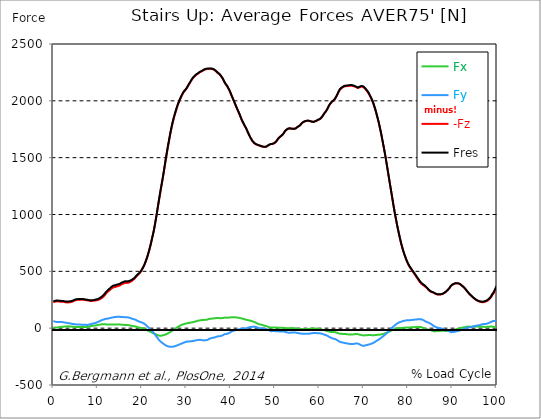
| Category |  Fx |  Fy |  -Fz |  Fres |
|---|---|---|---|---|
| 0.0 | 6.272 | 63.221 | 226.674 | 236.235 |
| 0.16678370786516855 | 5.522 | 60.516 | 229.602 | 238.31 |
| 0.3335674157303371 | 4.919 | 58.023 | 232.298 | 240.265 |
| 0.5003511235955057 | 4.818 | 56.18 | 234.225 | 241.682 |
| 0.6671348314606742 | 5.095 | 54.809 | 235.531 | 242.637 |
| 0.8339185393258427 | 5.679 | 54.077 | 236.42 | 243.378 |
| 1.0007022471910114 | 6.596 | 54.095 | 236.244 | 243.276 |
| 1.1674859550561796 | 7.717 | 54.234 | 235.142 | 242.294 |
| 1.3342696629213484 | 8.949 | 54.605 | 233.9 | 241.228 |
| 1.5010533707865168 | 10.08 | 54.753 | 232.965 | 240.385 |
| 1.6678370786516854 | 10.895 | 54.651 | 232.65 | 240.145 |
| 1.8346207865168538 | 11.608 | 54.614 | 232.307 | 239.904 |
| 2.001404494382023 | 12.183 | 54.234 | 231.983 | 239.598 |
| 2.1681882022471908 | 12.646 | 52.335 | 231.927 | 239.172 |
| 2.334971910112359 | 13.202 | 50.501 | 231.436 | 238.449 |
| 2.501755617977528 | 14.304 | 50.491 | 229.296 | 236.8 |
| 2.668539325842697 | 15.008 | 49.231 | 227.98 | 235.596 |
| 2.8353230337078656 | 15.49 | 47.277 | 227.156 | 234.641 |
| 3.0021067415730336 | 15.75 | 46.434 | 226.859 | 234.475 |
| 3.168890449438202 | 15.898 | 45.729 | 226.767 | 234.567 |
| 3.335674157303371 | 15.926 | 44.794 | 226.693 | 234.697 |
| 3.502457865168539 | 15.805 | 44.043 | 227.063 | 235.207 |
| 3.6692415730337076 | 15.342 | 42.505 | 227.628 | 235.901 |
| 3.8360252808988764 | 14.925 | 41.134 | 228.61 | 236.902 |
| 4.002808988764046 | 14.536 | 39.856 | 229.833 | 238.06 |
| 4.169592696629214 | 13.934 | 38.336 | 231.538 | 239.496 |
| 4.3363764044943816 | 13.396 | 37.215 | 233.974 | 241.692 |
| 4.50316011235955 | 12.85 | 36.419 | 236.568 | 244.267 |
| 4.669943820224718 | 12.109 | 35.854 | 239.626 | 247.223 |
| 4.836727528089888 | 11.219 | 35.631 | 243.211 | 250.502 |
| 5.003511235955056 | 10.506 | 34.001 | 246.454 | 253.143 |
| 5.170294943820225 | 10.163 | 32.444 | 248.186 | 254.467 |
| 5.337078651685394 | 10.135 | 31.629 | 249.029 | 255.227 |
| 5.5038623595505625 | 10.348 | 31.055 | 249.4 | 255.579 |
| 5.670646067415731 | 10.83 | 31.453 | 249.252 | 255.755 |
| 5.837429775280899 | 11.229 | 32.528 | 248.464 | 255.505 |
| 6.004213483146067 | 10.895 | 32.092 | 248.723 | 255.811 |
| 6.170997191011236 | 9.959 | 31.045 | 250.234 | 256.913 |
| 6.329002808988764 | 9.654 | 30.267 | 250.984 | 257.358 |
| 6.495786516853932 | 9.617 | 29.619 | 251.141 | 257.284 |
| 6.662570224719101 | 9.496 | 28.951 | 251.114 | 257.061 |
| 6.82935393258427 | 9.709 | 29.192 | 249.946 | 255.922 |
| 6.9961376404494375 | 9.793 | 29.804 | 248.084 | 254.152 |
| 7.162921348314607 | 10.172 | 30.1 | 246.871 | 252.744 |
| 7.329705056179775 | 10.061 | 29.081 | 246.583 | 251.948 |
| 7.496488764044945 | 9.904 | 27.877 | 246.38 | 251.243 |
| 7.663272471910113 | 10.83 | 28.284 | 245.231 | 249.974 |
| 7.830056179775281 | 11.998 | 29.09 | 243.86 | 248.575 |
| 7.996839887640449 | 13.498 | 30.425 | 242.146 | 246.945 |
| 8.16362359550562 | 15.481 | 32.963 | 240.626 | 245.518 |
| 8.330407303370787 | 17.093 | 34.825 | 239.876 | 244.981 |
| 8.497191011235955 | 18.427 | 36.502 | 239.83 | 245.184 |
| 8.663974719101123 | 19.65 | 38.207 | 239.978 | 245.518 |
| 8.830758426966291 | 20.762 | 39.791 | 240.2 | 245.963 |
| 8.99754213483146 | 21.707 | 41.208 | 240.589 | 246.657 |
| 9.16432584269663 | 22.855 | 43.098 | 241.256 | 247.667 |
| 9.331109550561798 | 23.541 | 44.395 | 242.359 | 249.085 |
| 9.497893258426966 | 24.291 | 46.054 | 243.86 | 250.928 |
| 9.664676966292134 | 25.051 | 47.795 | 245.648 | 253.05 |
| 9.831460674157304 | 26.339 | 50.584 | 246.5 | 254.486 |
| 9.998244382022472 | 27.858 | 53.678 | 246.982 | 255.496 |
| 10.16502808988764 | 28.72 | 55.967 | 249.409 | 258.368 |
| 10.331811797752808 | 29.906 | 58.894 | 252.096 | 261.647 |
| 10.498595505617978 | 31.166 | 62.109 | 255.329 | 265.576 |
| 10.665379213483147 | 32.389 | 65.454 | 259.044 | 270.06 |
| 10.832162921348315 | 33.482 | 69.02 | 263.167 | 275.053 |
| 10.998946629213483 | 34.427 | 72.346 | 267.512 | 280.158 |
| 11.165730337078653 | 34.677 | 75.061 | 272.116 | 285.207 |
| 11.33251404494382 | 34.103 | 75.922 | 278.546 | 291.498 |
| 11.49929775280899 | 34.047 | 77.961 | 285.744 | 299.002 |
| 11.666081460674157 | 34.149 | 80.666 | 293.675 | 307.395 |
| 11.832865168539326 | 33.639 | 82.491 | 302.467 | 316.289 |
| 11.999648876404493 | 32.963 | 83.668 | 310.314 | 324.09 |
| 12.166432584269662 | 31.953 | 83.112 | 315.974 | 329.389 |
| 12.333216292134832 | 31.749 | 84.121 | 322.395 | 335.837 |
| 12.5 | 31.675 | 85.687 | 328.148 | 341.711 |
| 12.66678370786517 | 32.453 | 88.059 | 333.493 | 347.538 |
| 12.833567415730336 | 32.861 | 89.754 | 339.163 | 353.505 |
| 13.000351123595506 | 33.148 | 91.376 | 345.111 | 359.703 |
| 13.167134831460674 | 33.278 | 92.951 | 350.234 | 364.974 |
| 13.333918539325843 | 32.972 | 93.923 | 354.616 | 369.43 |
| 13.500702247191011 | 32.694 | 94.915 | 358.915 | 373.812 |
| 13.667485955056181 | 32.963 | 96.119 | 360.796 | 375.98 |
| 13.834269662921349 | 33.074 | 97.444 | 361.583 | 377.157 |
| 14.001053370786519 | 33.13 | 99.176 | 362.352 | 378.472 |
| 14.167837078651687 | 32.87 | 99.074 | 364.909 | 380.789 |
| 14.334620786516853 | 32.944 | 99.315 | 367.615 | 383.355 |
| 14.501404494382026 | 33.269 | 99.908 | 369.023 | 384.819 |
| 14.668188202247192 | 33.491 | 100.362 | 370.134 | 385.977 |
| 14.834971910112362 | 33.232 | 100.325 | 372.2 | 387.885 |
| 15.001755617977528 | 32.361 | 99.575 | 375.749 | 391.017 |
| 15.168539325842698 | 31.434 | 98.871 | 380.057 | 394.935 |
| 15.335323033707864 | 30.573 | 98.342 | 384.42 | 398.938 |
| 15.502106741573034 | 30.397 | 98.398 | 387.552 | 401.967 |
| 15.6688904494382 | 30.054 | 98.046 | 390.192 | 404.598 |
| 15.83567415730337 | 28.961 | 96.851 | 393.351 | 407.507 |
| 16.00245786516854 | 28.72 | 96.953 | 395.547 | 409.685 |
| 16.16924157303371 | 28.266 | 96.554 | 398.271 | 412.167 |
| 16.336025280898877 | 27.895 | 95.85 | 399.04 | 412.658 |
| 16.502808988764045 | 28.257 | 96.267 | 397.706 | 411.519 |
| 16.669592696629216 | 27.738 | 95.433 | 398.215 | 411.732 |
| 16.83637640449438 | 27.117 | 94.479 | 398.928 | 412.084 |
| 17.003160112359552 | 26.209 | 93.173 | 400.679 | 413.372 |
| 17.169943820224717 | 24.968 | 91.44 | 403.644 | 415.725 |
| 17.336727528089888 | 23.661 | 89.513 | 406.942 | 418.375 |
| 17.503511235955056 | 22.077 | 87.021 | 410.935 | 421.562 |
| 17.670294943820224 | 20.493 | 84.464 | 415.28 | 425.11 |
| 17.837078651685395 | 18.964 | 81.907 | 420.19 | 429.279 |
| 18.003862359550563 | 17.973 | 80.027 | 424.758 | 433.318 |
| 18.17064606741573 | 17.102 | 78.461 | 430.224 | 438.386 |
| 18.3374297752809 | 16.231 | 76.793 | 436.885 | 444.667 |
| 18.504213483146067 | 14.749 | 74.366 | 444.528 | 451.801 |
| 18.662219101123597 | 13.341 | 71.522 | 452.31 | 458.944 |
| 18.829002808988765 | 11.108 | 67.844 | 459.981 | 465.762 |
| 18.995786516853933 | 8.792 | 64.036 | 467.411 | 472.387 |
| 19.1625702247191 | 6.837 | 60.812 | 473.369 | 477.797 |
| 19.32935393258427 | 5.142 | 58.274 | 478.39 | 482.401 |
| 19.49613764044944 | 3.993 | 56.059 | 485.579 | 489.303 |
| 19.662921348314608 | 2.779 | 53.753 | 494.658 | 498.077 |
| 19.829705056179776 | 1.649 | 51.492 | 505.025 | 508.157 |
| 19.996488764044944 | 0.435 | 49.157 | 516.059 | 518.941 |
| 20.163272471910112 | -0.917 | 46.702 | 527.39 | 530.039 |
| 20.33005617977528 | -2.613 | 43.663 | 539.1 | 541.435 |
| 20.49683988764045 | -5.003 | 39.494 | 553.849 | 555.813 |
| 20.663623595505616 | -7.736 | 34.77 | 570.145 | 571.785 |
| 20.830407303370787 | -10.71 | 29.628 | 587.386 | 588.748 |
| 20.997191011235955 | -14.138 | 23.763 | 605.591 | 606.703 |
| 21.163974719101123 | -17.825 | 17.269 | 624.713 | 625.649 |
| 21.330758426966295 | -21.438 | 10.645 | 645.892 | 646.79 |
| 21.497542134831463 | -24.968 | 4.141 | 668.386 | 669.331 |
| 21.66432584269663 | -28.498 | -2.335 | 691.742 | 692.835 |
| 21.8311095505618 | -31.768 | -8.616 | 716.533 | 717.83 |
| 21.997893258426966 | -34.705 | -14.897 | 743.317 | 744.809 |
| 22.164676966292134 | -37.512 | -21.077 | 771.296 | 773.056 |
| 22.331460674157306 | -40.254 | -27.488 | 800.368 | 802.397 |
| 22.498244382022467 | -43.21 | -34.807 | 828.411 | 830.69 |
| 22.66502808988764 | -46.304 | -42.681 | 857.983 | 860.624 |
| 22.831811797752806 | -49.574 | -51.288 | 892.558 | 895.727 |
| 22.99859550561798 | -52.993 | -60.256 | 928.949 | 932.72 |
| 23.165379213483146 | -56.208 | -69.243 | 967.082 | 971.492 |
| 23.332162921348313 | -58.848 | -78.007 | 1005.891 | 1010.894 |
| 23.49894662921348 | -61.423 | -86.929 | 1045.543 | 1051.157 |
| 23.665730337078653 | -63.758 | -95.674 | 1085.334 | 1091.569 |
| 23.83251404494382 | -65.787 | -104.031 | 1125.467 | 1132.305 |
| 23.999297752808985 | -66.473 | -111.053 | 1164.23 | 1171.512 |
| 24.166081460674157 | -66.936 | -117.492 | 1203.02 | 1210.701 |
| 24.332865168539325 | -66.074 | -122.791 | 1239.291 | 1247.221 |
| 24.499648876404496 | -64.722 | -127.887 | 1276.988 | 1285.113 |
| 24.666432584269664 | -63.443 | -132.64 | 1313.675 | 1321.976 |
| 24.833216292134832 | -61.803 | -137.124 | 1352.16 | 1360.6 |
| 25.0 | -59.737 | -141.839 | 1392.84 | 1401.438 |
| 25.16678370786517 | -57.81 | -146.481 | 1434.252 | 1442.989 |
| 25.33356741573034 | -55.633 | -150.798 | 1475.294 | 1484.151 |
| 25.500351123595504 | -53.308 | -154.67 | 1515.289 | 1524.22 |
| 25.66713483146067 | -50.269 | -157.932 | 1554.172 | 1563.14 |
| 25.833918539325843 | -46.137 | -159.72 | 1590.933 | 1599.772 |
| 26.00070224719101 | -41.653 | -160.989 | 1627.019 | 1635.681 |
| 26.16748595505618 | -37.66 | -162.323 | 1662.789 | 1671.312 |
| 26.334269662921347 | -34.093 | -163.87 | 1698.744 | 1707.166 |
| 26.50105337078652 | -30.063 | -164.574 | 1732.513 | 1740.777 |
| 26.667837078651687 | -25.644 | -164.315 | 1763.197 | 1771.229 |
| 26.834620786516858 | -21.03 | -163.852 | 1793.056 | 1800.839 |
| 27.001404494382022 | -16.565 | -163.036 | 1820.98 | 1828.521 |
| 27.16818820224719 | -12.303 | -161.591 | 1845.91 | 1853.229 |
| 27.334971910112362 | -7.866 | -159.581 | 1869.368 | 1876.409 |
| 27.50175561797753 | -3.428 | -157.478 | 1891.464 | 1898.264 |
| 27.668539325842698 | 0.778 | -155.375 | 1913.43 | 1920.008 |
| 27.835323033707866 | 4.836 | -152.892 | 1934.877 | 1941.205 |
| 28.002106741573037 | 8.94 | -150.242 | 1954.518 | 1960.595 |
| 28.168890449438205 | 12.952 | -147.481 | 1972.648 | 1978.494 |
| 28.335674157303373 | 16.991 | -144.646 | 1989.63 | 1995.244 |
| 28.502457865168537 | 20.678 | -141.885 | 2005.417 | 2010.8 |
| 28.669241573033705 | 23.819 | -139.254 | 2019.888 | 2025.085 |
| 28.836025280898877 | 27.191 | -136.392 | 2034.776 | 2039.751 |
| 29.002808988764052 | 30.063 | -133.779 | 2048.571 | 2053.37 |
| 29.169592696629213 | 32.259 | -131.426 | 2060.726 | 2065.386 |
| 29.336376404494384 | 34.603 | -128.869 | 2071.954 | 2076.466 |
| 29.50316011235955 | 36.873 | -126.321 | 2081.571 | 2085.953 |
| 29.669943820224724 | 38.494 | -123.755 | 2088.445 | 2092.725 |
| 29.836727528089884 | 39.902 | -121.67 | 2096.348 | 2100.517 |
| 30.003511235955056 | 41.144 | -120.123 | 2105.612 | 2109.67 |
| 30.170294943820224 | 44.127 | -117.538 | 2115.896 | 2119.796 |
| 30.337078651685395 | 44.979 | -117.798 | 2127.254 | 2131.145 |
| 30.503862359550563 | 45.618 | -118.057 | 2138.742 | 2142.615 |
| 30.670646067415728 | 46.656 | -117.492 | 2149.72 | 2153.547 |
| 30.837429775280903 | 48.481 | -115.954 | 2159.782 | 2163.534 |
| 30.99543539325843 | 49.546 | -115.269 | 2171.483 | 2175.188 |
| 31.162219101123597 | 50.491 | -115 | 2182.211 | 2185.898 |
| 31.32900280898876 | 51.594 | -114.009 | 2192.059 | 2195.7 |
| 31.495786516853936 | 52.993 | -112.851 | 2201.018 | 2204.622 |
| 31.6625702247191 | 54.892 | -111.442 | 2208.318 | 2211.885 |
| 31.82935393258427 | 56.884 | -110.006 | 2215.267 | 2218.796 |
| 31.996137640449433 | 58.848 | -108.617 | 2222.057 | 2225.55 |
| 32.162921348314605 | 60.33 | -107.348 | 2227.542 | 2231.007 |
| 32.329705056179776 | 61.618 | -106.217 | 2232.313 | 2235.75 |
| 32.49648876404494 | 63.665 | -104.689 | 2235.936 | 2239.363 |
| 32.66327247191011 | 66.343 | -102.65 | 2239.354 | 2242.764 |
| 32.83005617977528 | 66.88 | -103.058 | 2245.515 | 2248.943 |
| 32.996839887640455 | 67.844 | -103.169 | 2250.462 | 2253.909 |
| 33.16362359550562 | 69.271 | -102.808 | 2254.177 | 2257.642 |
| 33.330407303370784 | 70.521 | -103.058 | 2257.476 | 2260.996 |
| 33.497191011235955 | 71.327 | -104.8 | 2260.06 | 2263.683 |
| 33.66397471910113 | 71.411 | -106.782 | 2264.137 | 2267.861 |
| 33.83075842696629 | 71.614 | -107.829 | 2268.519 | 2272.299 |
| 33.997542134831455 | 72.309 | -107.348 | 2271.965 | 2275.754 |
| 34.164325842696634 | 73.023 | -106.773 | 2274.707 | 2278.487 |
| 34.3311095505618 | 73.995 | -105.949 | 2277.144 | 2280.915 |
| 34.49789325842697 | 74.273 | -105.634 | 2278.876 | 2282.656 |
| 34.66467696629213 | 74.162 | -105.541 | 2280.451 | 2284.25 |
| 34.831460674157306 | 76.247 | -102.372 | 2280.72 | 2284.491 |
| 34.99824438202247 | 79.61 | -96.666 | 2280.312 | 2284.055 |
| 35.16502808988764 | 81.324 | -93.618 | 2281.295 | 2285.037 |
| 35.331811797752806 | 82.584 | -91.042 | 2282.026 | 2285.76 |
| 35.49859550561798 | 83.102 | -89.541 | 2281.702 | 2285.417 |
| 35.66537921348315 | 83.705 | -87.596 | 2281.072 | 2284.75 |
| 35.83216292134831 | 84.807 | -85.511 | 2279.581 | 2283.222 |
| 35.998946629213485 | 85.428 | -84.288 | 2277.533 | 2281.156 |
| 36.16573033707865 | 86.048 | -83.278 | 2275.004 | 2278.617 |
| 36.33251404494382 | 86.641 | -82.018 | 2270.789 | 2274.43 |
| 36.499297752808985 | 87.383 | -80.314 | 2265.897 | 2269.519 |
| 36.666081460674164 | 88.411 | -78.118 | 2260.69 | 2264.294 |
| 36.83286516853932 | 89.671 | -75.135 | 2254.298 | 2257.892 |
| 36.99964887640449 | 90.607 | -72.726 | 2247.461 | 2251.018 |
| 37.166432584269664 | 90.208 | -71.744 | 2241.893 | 2245.395 |
| 37.333216292134836 | 88.782 | -71.485 | 2237.362 | 2240.818 |
| 37.5 | 87.392 | -71.188 | 2232.749 | 2236.139 |
| 37.666783707865164 | 87.373 | -69.836 | 2225.309 | 2228.672 |
| 37.833567415730336 | 87.864 | -67.862 | 2216.406 | 2219.732 |
| 38.00035112359551 | 88.624 | -65.583 | 2206.502 | 2209.801 |
| 38.16713483146068 | 89.198 | -63.647 | 2196.284 | 2199.582 |
| 38.333918539325836 | 90.032 | -60.219 | 2185.037 | 2188.316 |
| 38.50070224719101 | 91.82 | -55.948 | 2171.575 | 2174.846 |
| 38.66748595505618 | 93.145 | -52.622 | 2158.327 | 2161.607 |
| 38.83426966292135 | 93.108 | -51.233 | 2148.025 | 2151.268 |
| 39.001053370786515 | 92.571 | -50.621 | 2139.39 | 2142.596 |
| 39.16783707865169 | 92.321 | -49.889 | 2130.654 | 2133.841 |
| 39.33462078651686 | 92.385 | -47.443 | 2119.24 | 2122.381 |
| 39.50140449438202 | 93.034 | -44.896 | 2106.9 | 2110.05 |
| 39.668188202247194 | 93.534 | -42.404 | 2094.986 | 2098.108 |
| 39.83497191011236 | 94.081 | -38.753 | 2080.635 | 2083.748 |
| 40.00175561797753 | 94.915 | -34.871 | 2065.201 | 2068.332 |
| 40.168539325842694 | 95.545 | -30.11 | 2047.83 | 2050.998 |
| 40.335323033707866 | 95.498 | -27.404 | 2032.673 | 2035.851 |
| 40.50210674157304 | 95.637 | -24.736 | 2017.896 | 2021.037 |
| 40.6688904494382 | 95.665 | -22.439 | 2002.702 | 2005.806 |
| 40.83567415730337 | 95.609 | -20.076 | 1986.99 | 1990.084 |
| 41.00245786516854 | 95.174 | -18.14 | 1971.314 | 1974.381 |
| 41.16924157303371 | 94.488 | -16.639 | 1955 | 1958.038 |
| 41.33602528089887 | 93.933 | -15.305 | 1939.315 | 1942.326 |
| 41.502808988764045 | 93.46 | -13.498 | 1924.112 | 1927.104 |
| 41.669592696629216 | 92.385 | -12.229 | 1909.715 | 1912.661 |
| 41.83637640449439 | 91.144 | -11.173 | 1895.207 | 1898.097 |
| 42.00316011235955 | 89.977 | -10.024 | 1880.161 | 1882.996 |
| 42.16994382022472 | 88.624 | -8.468 | 1863.846 | 1866.635 |
| 42.33672752808989 | 87.142 | -6.846 | 1847.319 | 1850.052 |
| 42.50351123595506 | 85.576 | -5.485 | 1830.605 | 1833.283 |
| 42.670294943820224 | 83.779 | -4.345 | 1817.014 | 1819.646 |
| 42.83707865168539 | 81.842 | -4.03 | 1804.869 | 1807.463 |
| 43.00386235955057 | 80.008 | -3.632 | 1791.815 | 1794.381 |
| 43.17064606741573 | 78.137 | -2.752 | 1778.928 | 1781.457 |
| 43.32865168539326 | 76.154 | -1.964 | 1767.69 | 1770.21 |
| 43.495435393258425 | 74.357 | -0.787 | 1755.647 | 1758.139 |
| 43.6622191011236 | 72.921 | 1.297 | 1740.666 | 1743.139 |
| 43.82900280898876 | 71.438 | 3.511 | 1725.676 | 1728.131 |
| 43.99578651685393 | 69.873 | 5.475 | 1711.168 | 1713.586 |
| 44.162570224719104 | 68.39 | 7.551 | 1697.873 | 1700.254 |
| 44.32935393258427 | 66.815 | 8.82 | 1684.959 | 1687.293 |
| 44.49613764044944 | 65.231 | 10.07 | 1672.053 | 1674.341 |
| 44.66292134831461 | 63.258 | 11.127 | 1661.121 | 1663.354 |
| 44.82970505617978 | 61.247 | 12.164 | 1650.337 | 1652.524 |
| 44.99648876404493 | 59.043 | 12.831 | 1641.48 | 1643.648 |
| 45.16327247191011 | 56.902 | 13.091 | 1633.726 | 1635.848 |
| 45.33005617977528 | 54.846 | 13.026 | 1626.88 | 1628.946 |
| 45.49683988764045 | 52.409 | 12.516 | 1621.58 | 1623.581 |
| 45.66362359550561 | 49.074 | 10.849 | 1618.18 | 1620.052 |
| 45.83040730337079 | 45.739 | 8.968 | 1615.382 | 1617.133 |
| 45.99719101123596 | 42.385 | 6.754 | 1613.011 | 1614.623 |
| 46.16397471910113 | 39.115 | 4.54 | 1610.518 | 1612.01 |
| 46.33075842696629 | 35.965 | 2.085 | 1607.887 | 1609.258 |
| 46.497542134831455 | 33.825 | 0.25 | 1605.692 | 1607.007 |
| 46.66432584269663 | 32.379 | -0.954 | 1604.006 | 1605.303 |
| 46.83110955056179 | 31.036 | -1.251 | 1601.467 | 1602.699 |
| 46.99789325842696 | 29.498 | -1.695 | 1599.234 | 1600.411 |
| 47.164676966292134 | 27.701 | -2.492 | 1597.53 | 1598.669 |
| 47.331460674157306 | 25.894 | -3.298 | 1595.844 | 1596.946 |
| 47.49824438202247 | 23.782 | -4.484 | 1594.973 | 1596.066 |
| 47.66502808988764 | 21.679 | -5.67 | 1594.111 | 1595.186 |
| 47.83181179775281 | 19.807 | -6.596 | 1595.325 | 1596.362 |
| 47.99859550561797 | 17.945 | -7.523 | 1596.548 | 1597.53 |
| 48.16537921348314 | 15.768 | -9.718 | 1599.67 | 1600.633 |
| 48.33216292134831 | 13.396 | -12.757 | 1604.052 | 1604.997 |
| 48.498946629213485 | 11.015 | -15.796 | 1608.443 | 1609.37 |
| 48.66573033707865 | 8.644 | -18.835 | 1612.816 | 1613.733 |
| 48.83251404494382 | 6.67 | -22.355 | 1615.623 | 1616.55 |
| 48.99929775280899 | 4.697 | -25.866 | 1618.421 | 1619.357 |
| 49.166081460674164 | 4.456 | -26.876 | 1620.265 | 1621.219 |
| 49.33286516853933 | 5.346 | -25.663 | 1620.719 | 1621.645 |
| 49.499648876404486 | 6.216 | -24.282 | 1621.599 | 1622.516 |
| 49.666432584269664 | 6.281 | -24.264 | 1623.896 | 1624.814 |
| 49.83321629213483 | 5.8 | -25.273 | 1627 | 1627.908 |
| 50.0 | 5.763 | -26.015 | 1631.994 | 1632.911 |
| 50.166783707865164 | 5.966 | -26.617 | 1637.997 | 1638.923 |
| 50.33356741573034 | 6.031 | -26.867 | 1644.964 | 1645.89 |
| 50.50035112359551 | 5.716 | -27.043 | 1653.181 | 1654.099 |
| 50.66713483146068 | 4.15 | -27.775 | 1664.197 | 1665.123 |
| 50.83391853932584 | 3.659 | -28.266 | 1672.257 | 1673.202 |
| 51.00070224719101 | 3.9 | -28.46 | 1678.612 | 1679.548 |
| 51.16748595505618 | 3.65 | -28.544 | 1683.902 | 1684.81 |
| 51.33426966292134 | 3.558 | -28.544 | 1689.072 | 1689.952 |
| 51.50105337078652 | 3.928 | -28.349 | 1694.177 | 1695.038 |
| 51.66783707865169 | 4.28 | -28.266 | 1700.402 | 1701.273 |
| 51.83462078651686 | 4.104 | -28.581 | 1708.342 | 1709.231 |
| 52.00140449438202 | 2.622 | -29.989 | 1716.68 | 1717.56 |
| 52.168188202247194 | 1.427 | -31.36 | 1727.825 | 1728.733 |
| 52.33497191011236 | 0.491 | -32.592 | 1736.756 | 1737.655 |
| 52.50175561797752 | -0.315 | -34.547 | 1742.667 | 1743.566 |
| 52.668539325842694 | -1.047 | -36.53 | 1747.586 | 1748.513 |
| 52.835323033707866 | -1.797 | -38.596 | 1752.126 | 1753.08 |
| 53.00210674157304 | -1.908 | -40.097 | 1755.359 | 1756.286 |
| 53.1688904494382 | -1.297 | -40.662 | 1757.629 | 1758.528 |
| 53.33567415730337 | -0.213 | -40.263 | 1757.194 | 1758.092 |
| 53.502457865168545 | 0.584 | -39.291 | 1756.23 | 1757.101 |
| 53.669241573033716 | 0.343 | -38.753 | 1755.091 | 1755.943 |
| 53.83602528089887 | 0.102 | -38.225 | 1753.96 | 1754.785 |
| 54.002808988764045 | -0.167 | -37.845 | 1753.377 | 1754.183 |
| 54.169592696629216 | -0.472 | -37.632 | 1753.395 | 1754.201 |
| 54.33637640449438 | -0.778 | -37.428 | 1753.423 | 1754.238 |
| 54.50316011235955 | -0.889 | -37.836 | 1754.942 | 1755.739 |
| 54.669943820224724 | -1.112 | -38.336 | 1756.749 | 1757.527 |
| 54.836727528089895 | -2.538 | -39.837 | 1761.567 | 1762.363 |
| 55.00351123595506 | -4.076 | -41.394 | 1767.681 | 1768.533 |
| 55.17029494382022 | -6.05 | -43.497 | 1772.647 | 1773.527 |
| 55.337078651685395 | -6.559 | -44.534 | 1775.926 | 1776.816 |
| 55.50386235955056 | -6.392 | -44.905 | 1778.511 | 1779.41 |
| 55.66186797752809 | -6.726 | -45.98 | 1784.598 | 1785.515 |
| 55.82865168539326 | -7.606 | -47.499 | 1792.334 | 1793.279 |
| 55.995435393258425 | -8.106 | -48.564 | 1800.783 | 1801.756 |
| 56.1622191011236 | -8.236 | -48.935 | 1806.573 | 1807.574 |
| 56.32900280898877 | -8.431 | -49.333 | 1811.826 | 1812.855 |
| 56.49578651685393 | -8.579 | -49.222 | 1815.356 | 1816.375 |
| 56.6625702247191 | -8.727 | -49.111 | 1818.877 | 1819.896 |
| 56.82935393258427 | -8.31 | -48.601 | 1820.739 | 1821.721 |
| 56.99613764044943 | -7.736 | -48.277 | 1822.138 | 1823.073 |
| 57.16292134831461 | -6.754 | -47.842 | 1825.167 | 1826.066 |
| 57.329705056179776 | -6.365 | -48.537 | 1825.38 | 1826.288 |
| 57.49648876404495 | -6.745 | -48.981 | 1824.722 | 1825.64 |
| 57.66327247191011 | -6.244 | -48.657 | 1824.055 | 1824.945 |
| 57.83005617977529 | -5.41 | -47.703 | 1821.758 | 1822.601 |
| 57.99683988764044 | -4.734 | -46.628 | 1819.868 | 1820.674 |
| 58.16362359550561 | -4.123 | -45.201 | 1818.867 | 1819.673 |
| 58.33040730337079 | -3.845 | -44.405 | 1816.681 | 1817.459 |
| 58.497191011235955 | -3.131 | -43.358 | 1815.199 | 1815.949 |
| 58.66397471910112 | -2.159 | -42.265 | 1813.985 | 1814.698 |
| 58.83075842696629 | -2.362 | -42.552 | 1815.68 | 1816.403 |
| 58.99754213483147 | -2.64 | -42.793 | 1819.062 | 1819.794 |
| 59.164325842696634 | -3.168 | -43.247 | 1821.48 | 1822.221 |
| 59.33110955056179 | -3.974 | -43.599 | 1823.981 | 1824.722 |
| 59.49789325842697 | -4.855 | -43.978 | 1828.651 | 1829.392 |
| 59.664676966292134 | -5.716 | -44.432 | 1832.347 | 1833.088 |
| 59.8314606741573 | -6.606 | -44.766 | 1834.385 | 1835.145 |
| 59.99824438202247 | -7.467 | -45.387 | 1837.007 | 1837.785 |
| 60.16502808988765 | -7.662 | -45.665 | 1841.019 | 1841.797 |
| 60.33181179775281 | -8.773 | -46.526 | 1846.022 | 1846.837 |
| 60.49859550561798 | -10.71 | -47.666 | 1853.285 | 1854.137 |
| 60.66537921348315 | -13.304 | -50.149 | 1862.438 | 1863.383 |
| 60.83216292134831 | -15.685 | -52.354 | 1871.619 | 1872.657 |
| 60.99894662921348 | -17.473 | -55.29 | 1881.634 | 1882.783 |
| 61.16573033707864 | -18.909 | -57.523 | 1891.39 | 1892.631 |
| 61.33251404494383 | -19.631 | -58.866 | 1899.005 | 1900.311 |
| 61.49929775280899 | -21.16 | -61.285 | 1907.528 | 1908.927 |
| 61.66608146067416 | -23.031 | -64.258 | 1918.275 | 1919.804 |
| 61.83286516853932 | -25.125 | -67.677 | 1930.032 | 1931.709 |
| 61.99964887640451 | -27.46 | -71.364 | 1942.974 | 1944.762 |
| 62.16643258426967 | -29.785 | -75.042 | 1955.852 | 1957.77 |
| 62.33321629213482 | -31.314 | -78.22 | 1966.728 | 1968.767 |
| 62.5 | -32.833 | -81.815 | 1975.548 | 1977.753 |
| 62.66678370786517 | -34.362 | -85.641 | 1983.358 | 1985.748 |
| 62.833567415730336 | -35.353 | -88.698 | 1990.677 | 1993.206 |
| 63.0003511235955 | -34.64 | -90.579 | 1994.661 | 1997.273 |
| 63.16713483146068 | -34.677 | -92.219 | 2000.748 | 2003.425 |
| 63.33391853932585 | -34.408 | -93.201 | 2006.797 | 2009.512 |
| 63.500702247191015 | -35.168 | -94.952 | 2015.246 | 2018.054 |
| 63.66748595505618 | -36.511 | -97.314 | 2024.974 | 2027.92 |
| 63.83426966292135 | -38.438 | -100.408 | 2036.471 | 2039.575 |
| 64.00105337078651 | -40.94 | -104.809 | 2048.617 | 2051.934 |
| 64.16783707865169 | -43.33 | -109.339 | 2062.921 | 2066.498 |
| 64.33462078651687 | -45.692 | -113.833 | 2077.374 | 2081.2 |
| 64.50140449438203 | -47.629 | -117.816 | 2089.807 | 2093.893 |
| 64.6681882022472 | -48.833 | -120.818 | 2099.331 | 2103.62 |
| 64.83497191011236 | -49.426 | -122.606 | 2106.02 | 2110.439 |
| 65.00175561797754 | -49.945 | -124.116 | 2111.569 | 2116.09 |
| 65.16853932584269 | -50.306 | -125.932 | 2116.794 | 2121.427 |
| 65.33532303370787 | -50.51 | -127.377 | 2120.083 | 2124.817 |
| 65.50210674157304 | -50.714 | -128.897 | 2124.326 | 2129.144 |
| 65.66889044943821 | -51.177 | -130.305 | 2126.717 | 2131.636 |
| 65.83567415730337 | -51.742 | -131.222 | 2127.865 | 2132.85 |
| 66.00245786516854 | -52.326 | -132.084 | 2128.875 | 2133.934 |
| 66.1692415730337 | -53.308 | -133.52 | 2129.681 | 2134.86 |
| 66.33602528089888 | -54.151 | -134.946 | 2130.358 | 2135.657 |
| 66.50280898876404 | -54.725 | -136.373 | 2130.839 | 2136.241 |
| 66.66959269662921 | -55.031 | -137.392 | 2131.599 | 2137.074 |
| 66.83637640449439 | -55.068 | -138.013 | 2132.637 | 2138.149 |
| 67.00316011235955 | -55.216 | -138.587 | 2133.369 | 2138.909 |
| 67.16994382022472 | -55.439 | -139.143 | 2133.924 | 2139.492 |
| 67.33672752808988 | -55.578 | -139.495 | 2133.035 | 2138.622 |
| 67.50351123595506 | -55.559 | -139.579 | 2130.96 | 2136.565 |
| 67.67029494382022 | -54.559 | -138.708 | 2129.366 | 2134.888 |
| 67.83707865168539 | -53.873 | -138.587 | 2130.321 | 2135.814 |
| 67.99508426966291 | -52.613 | -136.262 | 2125.401 | 2130.737 |
| 68.16186797752809 | -51.649 | -134.289 | 2120.287 | 2125.503 |
| 68.32865168539327 | -51.835 | -134.168 | 2119.222 | 2124.438 |
| 68.49543539325843 | -52.048 | -133.983 | 2116.34 | 2121.547 |
| 68.6622191011236 | -52.455 | -134.029 | 2112.486 | 2117.712 |
| 68.82900280898876 | -54.762 | -137.188 | 2113.33 | 2118.786 |
| 68.99578651685394 | -56.495 | -141.07 | 2117.323 | 2123.094 |
| 69.1625702247191 | -57.866 | -144.757 | 2121.214 | 2127.282 |
| 69.32935393258425 | -58.718 | -147.602 | 2123.011 | 2129.32 |
| 69.49613764044945 | -60.293 | -150.733 | 2123.974 | 2130.617 |
| 69.66292134831461 | -61.979 | -153.531 | 2124.123 | 2131.08 |
| 69.82970505617978 | -63.258 | -155.032 | 2122.103 | 2129.237 |
| 69.99648876404494 | -63.962 | -155.217 | 2118.073 | 2125.234 |
| 70.16327247191012 | -63.369 | -153.883 | 2111.819 | 2118.879 |
| 70.33005617977528 | -62.859 | -152.391 | 2104.954 | 2111.884 |
| 70.49683988764045 | -61.924 | -150.446 | 2097.524 | 2104.287 |
| 70.66362359550561 | -61.637 | -148.936 | 2089.826 | 2096.477 |
| 70.83040730337079 | -61.349 | -147.416 | 2082.127 | 2088.658 |
| 70.99719101123596 | -60.997 | -145.591 | 2072.242 | 2078.634 |
| 71.16397471910112 | -60.784 | -143.831 | 2061.208 | 2067.47 |
| 71.3307584269663 | -60.701 | -141.987 | 2049.358 | 2055.491 |
| 71.49754213483146 | -60.747 | -140.042 | 2036.888 | 2042.901 |
| 71.66432584269663 | -61.016 | -137.633 | 2023.696 | 2029.551 |
| 71.83110955056179 | -61.701 | -135.549 | 2009.169 | 2014.894 |
| 71.99789325842697 | -62.118 | -132.945 | 1993.586 | 1999.163 |
| 72.16467696629215 | -62.016 | -129.508 | 1976.678 | 1982.033 |
| 72.3314606741573 | -61.627 | -125.719 | 1957.872 | 1962.995 |
| 72.49824438202248 | -61.423 | -122.226 | 1937.832 | 1942.77 |
| 72.66502808988764 | -60.756 | -118.252 | 1916.098 | 1920.823 |
| 72.8318117977528 | -59.83 | -113.944 | 1892.427 | 1896.911 |
| 72.99859550561797 | -58.857 | -109.636 | 1868.071 | 1872.305 |
| 73.16537921348315 | -58.348 | -105.884 | 1843.548 | 1847.587 |
| 73.33216292134833 | -58.06 | -102.141 | 1818.089 | 1821.952 |
| 73.49894662921349 | -57.514 | -97.963 | 1790.861 | 1794.539 |
| 73.66573033707864 | -56.643 | -93.164 | 1761.363 | 1764.818 |
| 73.83251404494382 | -55.772 | -88.402 | 1730.938 | 1734.171 |
| 73.99929775280899 | -54.679 | -83.491 | 1698.994 | 1702.005 |
| 74.16608146067415 | -53.336 | -78.266 | 1665.79 | 1668.56 |
| 74.33286516853933 | -51.807 | -73.078 | 1632.216 | 1634.754 |
| 74.49964887640449 | -49.871 | -68.029 | 1598.16 | 1600.457 |
| 74.66643258426967 | -47.731 | -62.785 | 1563.242 | 1565.308 |
| 74.83321629213484 | -45.396 | -57.134 | 1527.583 | 1529.408 |
| 75.0 | -42.867 | -51.047 | 1490.191 | 1491.757 |
| 75.16678370786516 | -40.467 | -45.118 | 1451.216 | 1452.568 |
| 75.33356741573033 | -38.012 | -39.041 | 1411.045 | 1412.222 |
| 75.5003511235955 | -35.603 | -33.102 | 1371.143 | 1372.162 |
| 75.66713483146067 | -32.704 | -26.311 | 1331.574 | 1332.39 |
| 75.83391853932585 | -29.359 | -19.011 | 1291.496 | 1292.21 |
| 76.00070224719101 | -26.218 | -12.266 | 1252.372 | 1252.965 |
| 76.16748595505618 | -22.939 | -5.939 | 1213.619 | 1214.11 |
| 76.33426966292136 | -19.52 | 0.324 | 1174.375 | 1174.782 |
| 76.50105337078652 | -16.37 | 6.735 | 1134.176 | 1134.593 |
| 76.66783707865167 | -13.396 | 12.813 | 1094.802 | 1095.274 |
| 76.83462078651685 | -10.515 | 18.77 | 1055.9 | 1056.438 |
| 77.00140449438202 | -8.042 | 24.245 | 1019.028 | 1019.667 |
| 77.1681882022472 | -6.022 | 29.47 | 984.379 | 985.212 |
| 77.33497191011236 | -4.058 | 34.575 | 950.183 | 951.221 |
| 77.50175561797754 | -2.094 | 39.365 | 915.71 | 916.97 |
| 77.6685393258427 | -0.602 | 43.691 | 883.377 | 884.887 |
| 77.83532303370787 | 0.25 | 47.267 | 852.916 | 854.685 |
| 78.00210674157303 | 0.908 | 50.612 | 822.964 | 825.002 |
| 78.1688904494382 | 1.529 | 53.512 | 793.271 | 795.559 |
| 78.33567415730337 | 1.834 | 55.494 | 765.209 | 767.692 |
| 78.50245786516854 | 2.122 | 57.347 | 739.139 | 741.807 |
| 78.66924157303372 | 2.455 | 59.487 | 714.162 | 717.098 |
| 78.83602528089888 | 2.918 | 61.785 | 691.121 | 694.354 |
| 79.00280898876404 | 3.382 | 63.619 | 669.646 | 673.185 |
| 79.16959269662921 | 4.299 | 65.37 | 650.07 | 653.887 |
| 79.33637640449439 | 5.114 | 66.982 | 630.902 | 634.978 |
| 79.50316011235955 | 5.586 | 67.927 | 612.892 | 617.163 |
| 79.66994382022472 | 5.837 | 68.613 | 595.521 | 599.977 |
| 79.8367275280899 | 6.17 | 69.298 | 579.678 | 584.292 |
| 80.00351123595506 | 6.133 | 69.308 | 565.643 | 570.358 |
| 80.17029494382022 | 6.365 | 69.613 | 552.839 | 557.685 |
| 80.32830056179776 | 6.596 | 69.975 | 541.444 | 546.465 |
| 80.49508426966293 | 6.763 | 70.253 | 531.188 | 536.376 |
| 80.66186797752809 | 7.143 | 70.873 | 521.636 | 527.01 |
| 80.82865168539325 | 7.68 | 71.809 | 511.659 | 517.245 |
| 80.99543539325842 | 8.208 | 72.865 | 501.81 | 507.666 |
| 81.1622191011236 | 8.496 | 73.68 | 492.917 | 499.059 |
| 81.32900280898878 | 8.727 | 74.459 | 484.189 | 490.619 |
| 81.49578651685394 | 9.255 | 75.061 | 474.369 | 481.021 |
| 81.6625702247191 | 9.663 | 75.644 | 464.252 | 471.154 |
| 81.82935393258427 | 10.098 | 76.627 | 454.265 | 461.501 |
| 81.99613764044945 | 10.348 | 77.377 | 444.612 | 452.107 |
| 82.16292134831461 | 10.478 | 77.942 | 435.116 | 442.805 |
| 82.32970505617978 | 10.376 | 78.303 | 425.694 | 433.568 |
| 82.49648876404494 | 10.2 | 78.896 | 416.327 | 424.424 |
| 82.66327247191012 | 10.45 | 79.489 | 406.108 | 414.428 |
| 82.83005617977528 | 9.181 | 78.257 | 398.178 | 406.34 |
| 82.99683988764045 | 8.292 | 78.062 | 391.248 | 399.401 |
| 83.16362359550563 | 6.763 | 76.673 | 385.893 | 393.824 |
| 83.33040730337079 | 4.679 | 74.19 | 381.141 | 388.645 |
| 83.49719101123596 | 1.946 | 70.28 | 376.962 | 383.818 |
| 83.66397471910112 | -0.973 | 65.722 | 372.784 | 378.917 |
| 83.8307584269663 | -3.613 | 62.572 | 367.429 | 373.099 |
| 83.99754213483146 | -6.254 | 59.32 | 362.01 | 367.327 |
| 84.16432584269663 | -8.977 | 55.707 | 356.775 | 361.741 |
| 84.33110955056179 | -10.747 | 52.715 | 350.04 | 354.765 |
| 84.49789325842697 | -11.821 | 50.417 | 342.184 | 346.714 |
| 84.66467696629213 | -12.794 | 47.684 | 334.837 | 339.154 |
| 84.8314606741573 | -14.11 | 44.673 | 328.87 | 332.947 |
| 84.99824438202248 | -15.796 | 41.292 | 324.34 | 328.083 |
| 85.16502808988764 | -17.88 | 37.605 | 320.505 | 323.84 |
| 85.3318117977528 | -20.4 | 33.352 | 318.059 | 321.033 |
| 85.49859550561797 | -23.226 | 28.655 | 315.984 | 318.689 |
| 85.66537921348315 | -25.857 | 23.939 | 313.667 | 316.123 |
| 85.83216292134831 | -27.126 | 19.177 | 310.749 | 313.056 |
| 85.99894662921348 | -27.404 | 14.925 | 307.247 | 309.554 |
| 86.16573033707866 | -27.015 | 11.784 | 303.458 | 305.756 |
| 86.33251404494384 | -26.524 | 8.866 | 299.863 | 302.124 |
| 86.499297752809 | -25.422 | 7.245 | 297.381 | 299.521 |
| 86.66608146067415 | -25.44 | 4.53 | 296.361 | 298.437 |
| 86.83286516853933 | -25.375 | 1.64 | 296.222 | 298.251 |
| 86.99964887640449 | -24.745 | -0.343 | 296.269 | 298.288 |
| 87.16643258426966 | -23.402 | 0.009 | 296.454 | 298.233 |
| 87.33321629213482 | -22.309 | -0.046 | 296.769 | 298.344 |
| 87.5 | -22.374 | -1.927 | 297.788 | 299.308 |
| 87.66678370786518 | -22.568 | -3.873 | 299.224 | 300.706 |
| 87.83356741573033 | -22.744 | -5.688 | 301.438 | 302.939 |
| 88.00035112359551 | -22.902 | -6.735 | 304.875 | 306.413 |
| 88.16713483146067 | -23.606 | -9.126 | 308.868 | 310.518 |
| 88.33391853932584 | -24.273 | -12.627 | 312.676 | 314.511 |
| 88.500702247191 | -24.56 | -15.092 | 317.521 | 319.523 |
| 88.66748595505618 | -24.56 | -16.593 | 323.886 | 325.971 |
| 88.83426966292136 | -24.875 | -19.659 | 330.13 | 332.372 |
| 89.00105337078652 | -24.718 | -23.393 | 335.42 | 337.829 |
| 89.16783707865169 | -24.56 | -25.903 | 341.572 | 344.073 |
| 89.33462078651687 | -24.199 | -28.738 | 350.299 | 352.912 |
| 89.50140449438203 | -23.726 | -31.861 | 360.092 | 362.825 |
| 89.6681882022472 | -23.208 | -34.844 | 369.708 | 372.543 |
| 89.83497191011236 | -21.447 | -35.075 | 376.082 | 378.723 |
| 90.00175561797754 | -19.937 | -35.038 | 381.085 | 383.531 |
| 90.16853932584269 | -18.316 | -34.204 | 384.309 | 386.551 |
| 90.33532303370787 | -16.352 | -32.815 | 387.45 | 389.46 |
| 90.50210674157303 | -13.98 | -31.314 | 391.109 | 392.907 |
| 90.6688904494382 | -12.248 | -30.35 | 394.083 | 395.723 |
| 90.83567415730336 | -10.636 | -29.155 | 395.278 | 396.798 |
| 91.00245786516854 | -8.94 | -27.432 | 394.787 | 396.195 |
| 91.1692415730337 | -7.541 | -25.903 | 394.333 | 395.658 |
| 91.33602528089888 | -6.013 | -24.56 | 393.323 | 394.565 |
| 91.50280898876404 | -4.299 | -22.948 | 391.711 | 392.851 |
| 91.66959269662922 | -2.705 | -21.355 | 388.904 | 389.988 |
| 91.83637640449439 | -0.547 | -18.964 | 384.346 | 385.365 |
| 92.00316011235955 | 2.038 | -15.796 | 379.056 | 380.057 |
| 92.16994382022472 | 4.132 | -12.553 | 373.405 | 374.368 |
| 92.3367275280899 | 5.744 | -9.978 | 368.207 | 369.152 |
| 92.50351123595506 | 6.958 | -8.116 | 363.223 | 364.15 |
| 92.66151685393258 | 8.245 | -6.059 | 357.016 | 357.979 |
| 92.82830056179776 | 9.654 | -3.798 | 350.021 | 351.04 |
| 92.99508426966291 | 10.876 | -1.455 | 341.628 | 342.776 |
| 93.16186797752809 | 12.025 | 0.908 | 332.743 | 334.04 |
| 93.32865168539325 | 13.007 | 3.029 | 324.664 | 326.082 |
| 93.49543539325842 | 13.647 | 4.855 | 317.345 | 318.874 |
| 93.66221910112358 | 14.202 | 7.013 | 308.813 | 310.471 |
| 93.82900280898876 | 14.202 | 8.755 | 300.697 | 302.337 |
| 93.99578651685393 | 12.275 | 8.301 | 295.185 | 296.593 |
| 94.1625702247191 | 11.775 | 9.014 | 289.404 | 290.71 |
| 94.32935393258427 | 12.498 | 10.876 | 282.752 | 284.03 |
| 94.49613764044945 | 12.85 | 12.535 | 276.684 | 277.934 |
| 94.66292134831461 | 13.767 | 14.675 | 270.449 | 271.755 |
| 94.82970505617978 | 14.128 | 16.491 | 265.196 | 266.613 |
| 94.99648876404494 | 14.601 | 18.279 | 259.896 | 261.462 |
| 95.16327247191012 | 14.851 | 19.696 | 254.792 | 256.515 |
| 95.33005617977528 | 15.036 | 21.067 | 249.807 | 251.697 |
| 95.49683988764046 | 14.832 | 22.17 | 245.564 | 247.667 |
| 95.66362359550563 | 14.582 | 23.272 | 241.432 | 243.739 |
| 95.83040730337078 | 13.665 | 24.384 | 238.783 | 241.228 |
| 95.99719101123594 | 12.989 | 25.607 | 236.105 | 238.736 |
| 96.16397471910112 | 12.553 | 27.024 | 233.391 | 236.3 |
| 96.33075842696628 | 12.581 | 28.998 | 231.251 | 234.725 |
| 96.49754213483145 | 12.739 | 31.101 | 229.416 | 233.502 |
| 96.66432584269663 | 12.933 | 33.195 | 228.388 | 233.002 |
| 96.8311095505618 | 13.017 | 34.992 | 227.906 | 232.881 |
| 96.99789325842697 | 12.553 | 35.863 | 228.629 | 233.734 |
| 97.16467696629213 | 11.784 | 36.28 | 230.12 | 235.318 |
| 97.3314606741573 | 11.247 | 36.437 | 232.001 | 237.254 |
| 97.49824438202248 | 10.7 | 36.595 | 233.882 | 239.2 |
| 97.66502808988764 | 10.71 | 38.04 | 236.226 | 241.821 |
| 97.8318117977528 | 11.219 | 40.078 | 239.32 | 245.305 |
| 97.99859550561798 | 11.812 | 42.404 | 243.156 | 249.557 |
| 98.16537921348316 | 12.368 | 44.331 | 247.751 | 254.514 |
| 98.33216292134833 | 12.915 | 47.304 | 254.106 | 261.49 |
| 98.49894662921349 | 13.665 | 50.584 | 260.184 | 268.309 |
| 98.66573033707866 | 14.388 | 54.021 | 266.974 | 275.878 |
| 98.8325140449438 | 13.971 | 56.847 | 277.61 | 286.708 |
| 98.99929775280897 | 13.508 | 59.598 | 289.589 | 298.863 |
| 99.16608146067416 | 13.119 | 61.915 | 298.566 | 307.933 |
| 99.33286516853933 | 12.627 | 64.101 | 307.414 | 316.817 |
| 99.49964887640449 | 10.376 | 63.98 | 321.542 | 330.427 |
| 99.66643258426966 | 8.06 | 63.703 | 336.06 | 344.5 |
| 99.83321629213484 | 5.901 | 63.564 | 350.401 | 358.535 |
| 100.0 | 3.743 | 63.415 | 364.752 | 372.571 |